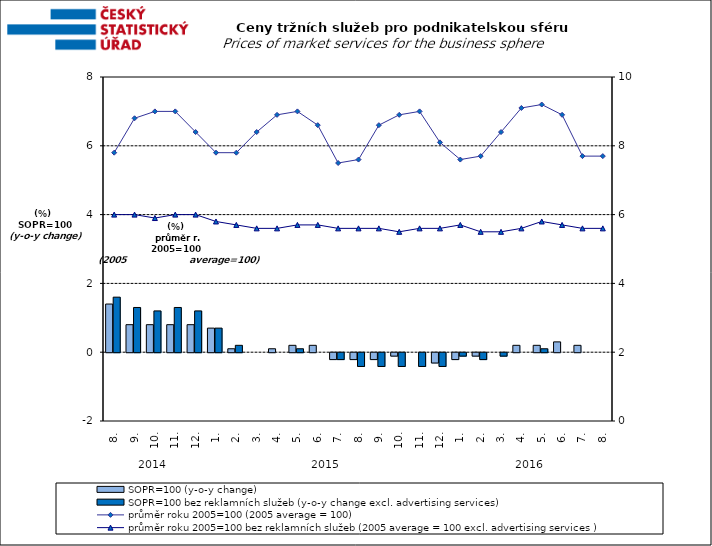
| Category | SOPR=100 (y-o-y change)   | SOPR=100 bez reklamních služeb (y-o-y change excl. advertising services)   |
|---|---|---|
| 0 | 1.4 | 1.6 |
| 1 | 0.8 | 1.3 |
| 2 | 0.8 | 1.2 |
| 3 | 0.8 | 1.3 |
| 4 | 0.8 | 1.2 |
| 5 | 0.7 | 0.7 |
| 6 | 0.1 | 0.2 |
| 7 | 0 | 0 |
| 8 | 0.1 | 0 |
| 9 | 0.2 | 0.1 |
| 10 | 0.2 | 0 |
| 11 | -0.2 | -0.2 |
| 12 | -0.2 | -0.4 |
| 13 | -0.2 | -0.4 |
| 14 | -0.1 | -0.4 |
| 15 | 0 | -0.4 |
| 16 | -0.3 | -0.4 |
| 17 | -0.2 | -0.1 |
| 18 | -0.1 | -0.2 |
| 19 | 0 | -0.1 |
| 20 | 0.2 | 0 |
| 21 | 0.2 | 0.1 |
| 22 | 0.3 | 0 |
| 23 | 0.2 | 0 |
| 24 | 0 | 0 |